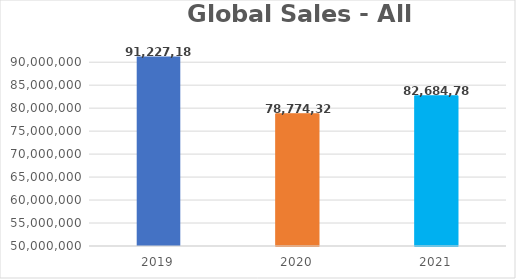
| Category | Series 0 |
|---|---|
| 2019.0 | 91227182 |
| 2020.0 | 78774320 |
| 2021.0 | 82684788 |